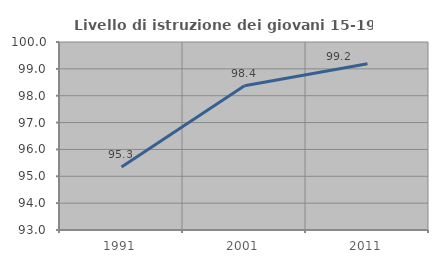
| Category | Livello di istruzione dei giovani 15-19 anni |
|---|---|
| 1991.0 | 95.349 |
| 2001.0 | 98.374 |
| 2011.0 | 99.187 |